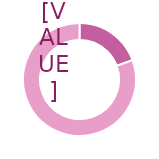
| Category | Series 0 |
|---|---|
| 0 | 0.194 |
| 1 | 0.806 |